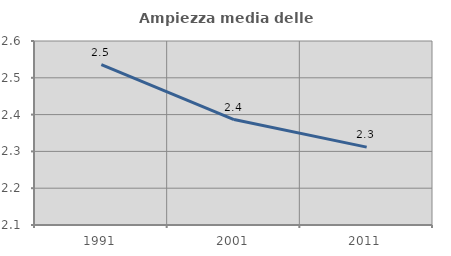
| Category | Ampiezza media delle famiglie |
|---|---|
| 1991.0 | 2.536 |
| 2001.0 | 2.386 |
| 2011.0 | 2.312 |